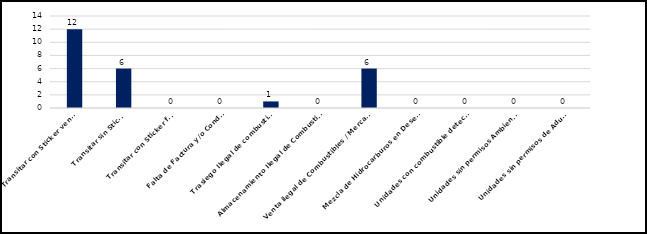
| Category | Series 0 |
|---|---|
| Transitar con Sticker vencido | 12 |
| Transitar sin Sticker | 6 |
| Transitar con Sticker falso | 0 |
| Falta de Factura y/o Conduce | 0 |
| Trasiego Ilegal de combustibles  | 1 |
| Almacenamiento Ilegal de Combustibles  | 0 |
| Venta ilegal de Combustibles / Mercancías | 6 |
| Mezcla de Hidrocarburos en Desechos | 0 |
| Unidades con combustible detectado  | 0 |
| Unidades sin permisos Ambientales | 0 |
| Unidades sin permisos de Aduanas  | 0 |